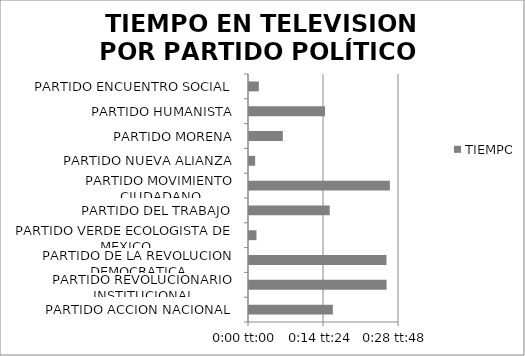
| Category | TIEMPO  |
|---|---|
| PARTIDO ACCION NACIONAL | 0.011 |
| PARTIDO REVOLUCIONARIO INSTITUCIONAL | 0.018 |
| PARTIDO DE LA REVOLUCION DEMOCRATICA | 0.018 |
| PARTIDO VERDE ECOLOGISTA DE MEXICO | 0.001 |
| PARTIDO DEL TRABAJO | 0.011 |
| PARTIDO MOVIMIENTO CIUDADANO | 0.019 |
| PARTIDO NUEVA ALIANZA | 0.001 |
| PARTIDO MORENA | 0.005 |
| PARTIDO HUMANISTA | 0.01 |
| PARTIDO ENCUENTRO SOCIAL | 0.001 |